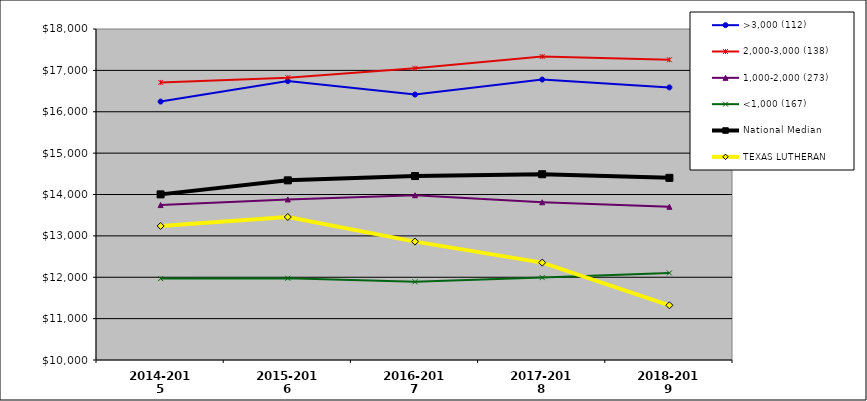
| Category | >3,000 (112) | 2,000-3,000 (138) | 1,000-2,000 (273) | <1,000 (167) | National Median |  TEXAS LUTHERAN  |
|---|---|---|---|---|---|---|
| 2014-2015 | 16245.935 | 16708.647 | 13744.529 | 11967.125 | 14002.887 | 13239.91 |
| 2015-2016 | 16740.637 | 16823.644 | 13879.9 | 11975.774 | 14342.086 | 13456.186 |
| 2016-2017 | 16415.577 | 17050.261 | 13981.808 | 11890.983 | 14445.621 | 12861.172 |
| 2017-2018 | 16778.085 | 17333.887 | 13812.235 | 11991.34 | 14489.448 | 12353.524 |
| 2018-2019 | 16588.228 | 17257.067 | 13703.137 | 12102.81 | 14402.238 | 11322.153 |